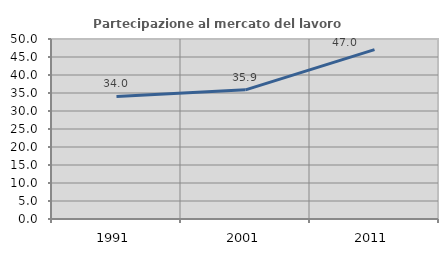
| Category | Partecipazione al mercato del lavoro  femminile |
|---|---|
| 1991.0 | 34.032 |
| 2001.0 | 35.873 |
| 2011.0 | 47.034 |